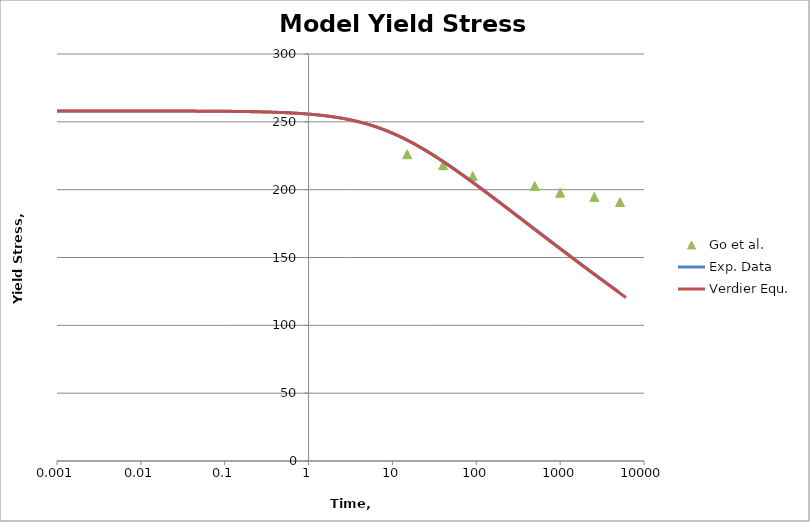
| Category | Go et al. |
|---|---|
| 0.0 | 258 |
| 15.012879542386322 | 226.184 |
| 40.273650789130926 | 217.992 |
| 90.77139294024566 | 210.12 |
| 498.21867224617483 | 202.731 |
| 999.8388320324435 | 197.751 |
| 2555.524212115162 | 194.698 |
| 5178.333299096869 | 190.843 |